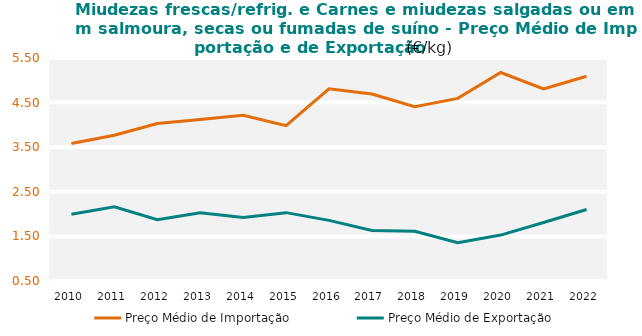
| Category | Preço Médio de Importação | Preço Médio de Exportação |
|---|---|---|
| 2010.0 | 3.582 | 1.998 |
| 2011.0 | 3.769 | 2.163 |
| 2012.0 | 4.033 | 1.872 |
| 2013.0 | 4.121 | 2.028 |
| 2014.0 | 4.217 | 1.925 |
| 2015.0 | 3.983 | 2.033 |
| 2016.0 | 4.811 | 1.86 |
| 2017.0 | 4.694 | 1.632 |
| 2018.0 | 4.407 | 1.615 |
| 2019.0 | 4.595 | 1.36 |
| 2020.0 | 5.175 | 1.53 |
| 2021.0 | 4.809 | 1.81 |
| 2022.0 | 5.09 | 2.104 |